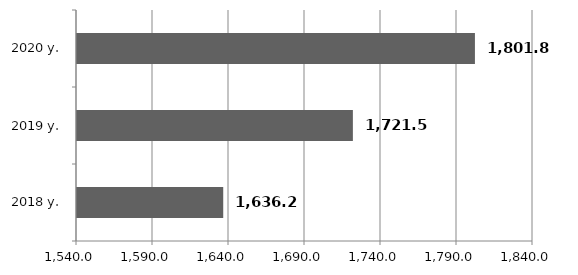
| Category | Series 0 |
|---|---|
| 2018 y. | 1636.2 |
| 2019 y. | 1721.5 |
| 2020 y. | 1801.8 |